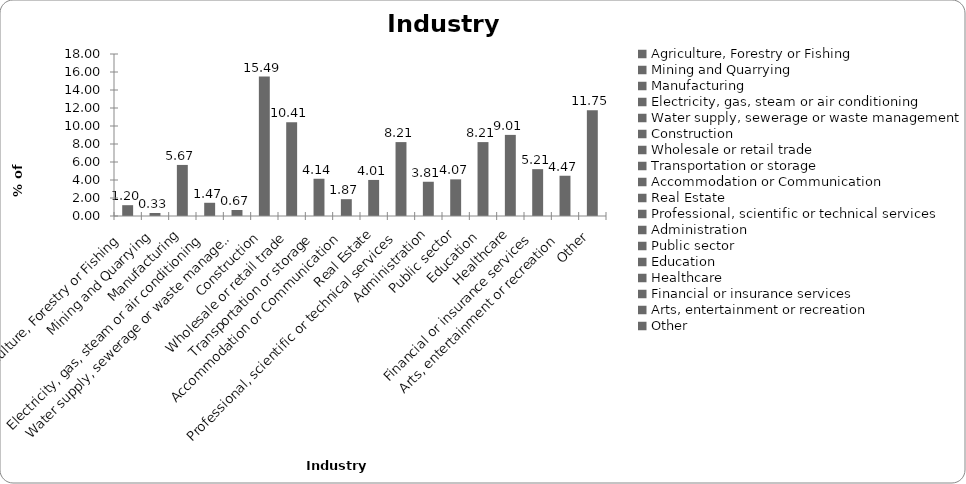
| Category | Series 0 |
|---|---|
| Agriculture, Forestry or Fishing | 1.202 |
| Mining and Quarrying | 0.334 |
| Manufacturing | 5.674 |
| Electricity, gas, steam or air conditioning | 1.469 |
| Water supply, sewerage or waste management | 0.668 |
| Construction | 15.487 |
| Wholesale or retail trade | 10.414 |
| Transportation or storage | 4.139 |
| Accommodation or Communication | 1.869 |
| Real Estate | 4.005 |
| Professional, scientific or technical services | 8.211 |
| Administration | 3.805 |
| Public sector | 4.072 |
| Education | 8.211 |
| Healthcare | 9.012 |
| Financial or insurance services | 5.207 |
| Arts, entertainment or recreation | 4.473 |
| Other | 11.749 |